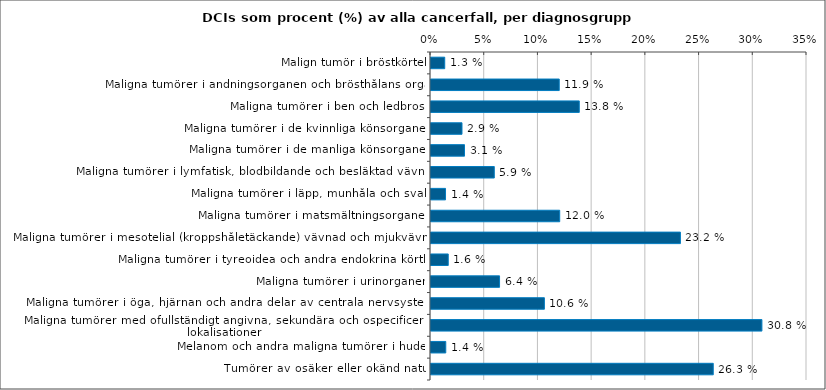
| Category | DCI (%)** |
|---|---|
| Malign tumör i bröstkörtel | 0.013 |
| Maligna tumörer i andningsorganen och brösthålans organ | 0.119 |
| Maligna tumörer i ben och ledbrosk | 0.138 |
| Maligna tumörer i de kvinnliga könsorganen | 0.029 |
| Maligna tumörer i de manliga könsorganen | 0.031 |
| Maligna tumörer i lymfatisk, blodbildande och besläktad vävnad | 0.059 |
| Maligna tumörer i läpp, munhåla och svalg | 0.014 |
| Maligna tumörer i matsmältningsorganen | 0.12 |
| Maligna tumörer i mesotelial (kroppshåletäckande) vävnad och mjukvävnad | 0.232 |
| Maligna tumörer i tyreoidea och andra endokrina körtlar | 0.016 |
| Maligna tumörer i urinorganen | 0.064 |
| Maligna tumörer i öga, hjärnan och andra delar av centrala nervsystemet | 0.106 |
| Maligna tumörer med ofullständigt angivna, sekundära och ospecificerade lokalisationer | 0.308 |
| Melanom och andra maligna tumörer i huden | 0.014 |
| Tumörer av osäker eller okänd natur | 0.263 |